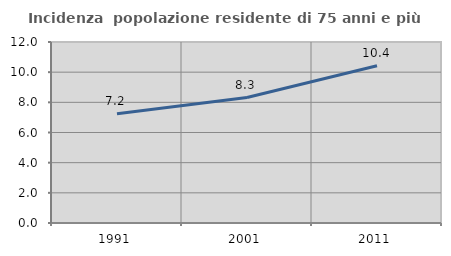
| Category | Incidenza  popolazione residente di 75 anni e più |
|---|---|
| 1991.0 | 7.242 |
| 2001.0 | 8.317 |
| 2011.0 | 10.424 |